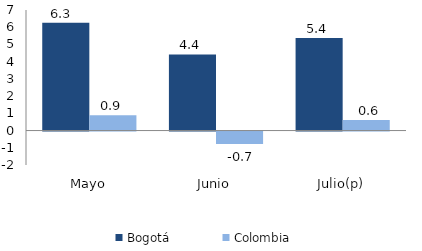
| Category | Bogotá | Colombia |
|---|---|---|
| Mayo | 6.264 | 0.884 |
| Junio | 4.421 | -0.728 |
| Julio(p) | 5.378 | 0.612 |